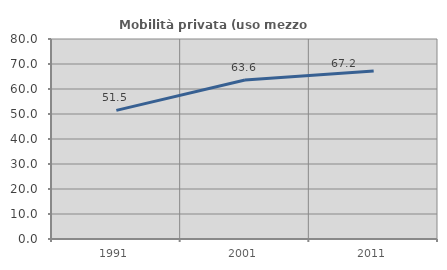
| Category | Mobilità privata (uso mezzo privato) |
|---|---|
| 1991.0 | 51.451 |
| 2001.0 | 63.589 |
| 2011.0 | 67.209 |